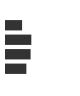
| Category | Series 0 |
|---|---|
| 0 | 0.227 |
| 1 | 0.357 |
| 2 | 0.347 |
| 3 | 0.287 |